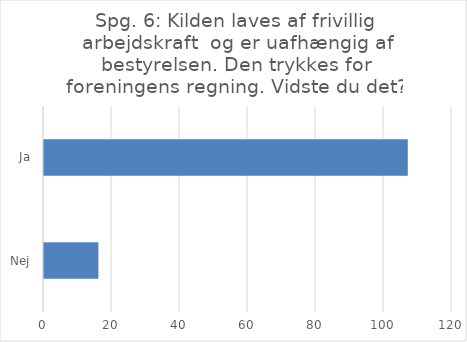
| Category | Svar |
|---|---|
| Nej | 16 |
| Ja | 107 |